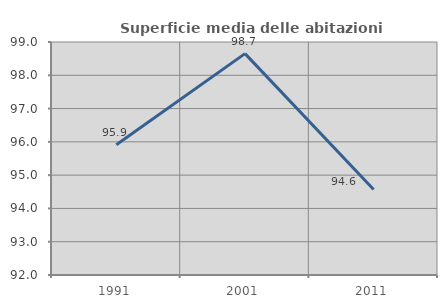
| Category | Superficie media delle abitazioni occupate |
|---|---|
| 1991.0 | 95.914 |
| 2001.0 | 98.651 |
| 2011.0 | 94.566 |